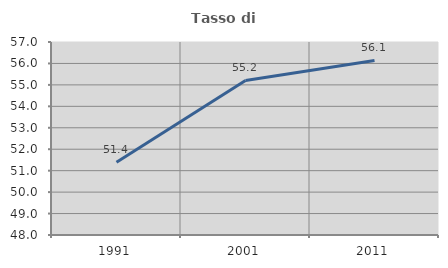
| Category | Tasso di occupazione   |
|---|---|
| 1991.0 | 51.394 |
| 2001.0 | 55.21 |
| 2011.0 | 56.141 |